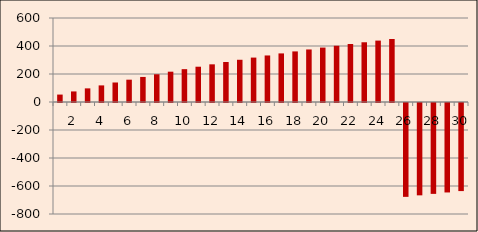
| Category | Series 0 |
|---|---|
| nan | 53.038 |
| 2.0 | 75.499 |
| nan | 97.356 |
| 4.0 | 118.623 |
| nan | 139.314 |
| 6.0 | 159.441 |
| nan | 179.017 |
| 8.0 | 198.055 |
| nan | 216.568 |
| 10.0 | 234.567 |
| nan | 252.063 |
| 12.0 | 269.069 |
| nan | 285.594 |
| 14.0 | 301.651 |
| nan | 317.249 |
| 16.0 | 332.398 |
| nan | 347.109 |
| 18.0 | 361.391 |
| nan | 375.254 |
| 20.0 | 388.706 |
| nan | 401.758 |
| 22.0 | 414.416 |
| nan | 426.691 |
| 24.0 | 438.59 |
| nan | 450.121 |
| 26.0 | -670.415 |
| nan | -659.596 |
| 28.0 | -649.122 |
| nan | -638.985 |
| 30.0 | -629.179 |